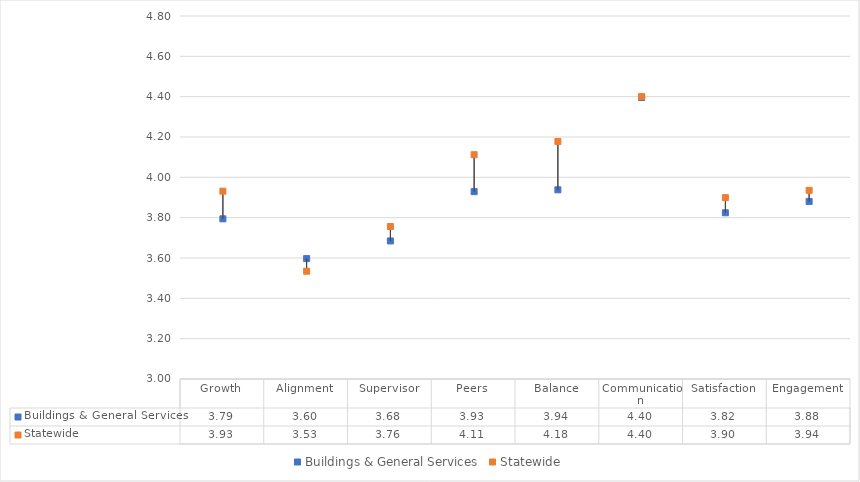
| Category | Buildings & General Services | Statewide |
|---|---|---|
| Growth | 3.794 | 3.931 |
| Alignment | 3.597 | 3.534 |
| Supervisor | 3.685 | 3.756 |
| Peers | 3.929 | 4.112 |
| Balance | 3.938 | 4.178 |
| Communication | 4.396 | 4.4 |
| Satisfaction | 3.824 | 3.899 |
| Engagement | 3.88 | 3.936 |